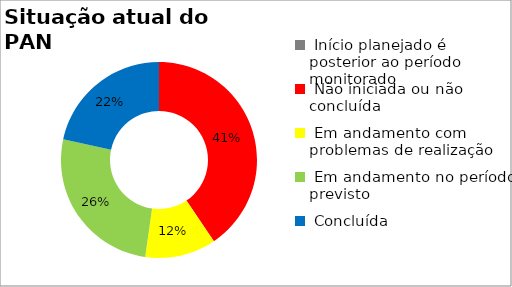
| Category | Series 0 |
|---|---|
|  Início planejado é posterior ao período monitorado | 0 |
|  Não iniciada ou não concluída | 0.405 |
|  Em andamento com problemas de realização | 0.117 |
|  Em andamento no período previsto  | 0.261 |
|  Concluída | 0.216 |